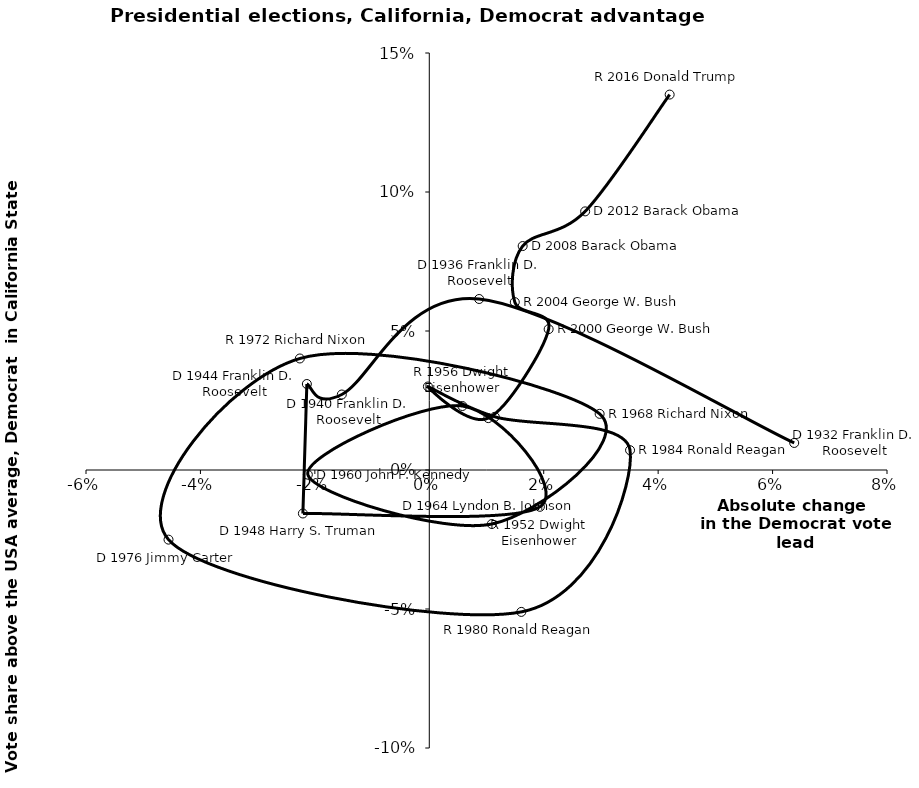
| Category | Series 0 |
|---|---|
| 0.06378371585600959 | 0.01 |
| 0.008714530609959081 | 0.062 |
| -0.015286841687751629 | 0.027 |
| -0.021398488127285814 | 0.031 |
| -0.02209100911068526 | -0.016 |
| 0.019330411588411006 | -0.013 |
| 0.00578770536399878 | 0.023 |
| -0.021225292547496888 | -0.002 |
| 0.010932184159763048 | -0.019 |
| 0.02977276634305029 | 0.02 |
| -0.022621733476287875 | 0.04 |
| -0.04557793918570108 | -0.025 |
| 0.01608499908552133 | -0.051 |
| 0.035089722092606496 | 0.007 |
| 0.0114564368635455 | 0.019 |
| -0.00023802582107984582 | 0.03 |
| 0.010313383541153326 | 0.019 |
| 0.020863444326296166 | 0.051 |
| 0.01494621666975901 | 0.06 |
| 0.01632045204726379 | 0.081 |
| 0.02724367803410463 | 0.093 |
| 0.04201243502681479 | 0.135 |